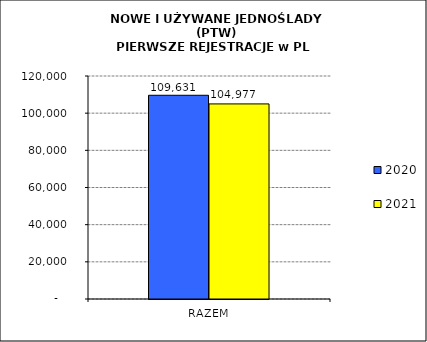
| Category | 2020 | 2021 |
|---|---|---|
| RAZEM | 109631 | 104977 |